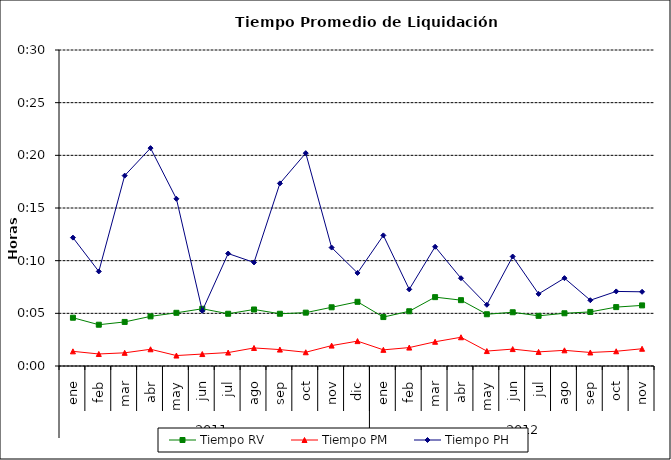
| Category | Tiempo RV | Tiempo PM | Tiempo PH |
|---|---|---|---|
| 0 | 0.003 | 0.001 | 0.009 |
| 1 | 0.003 | 0.001 | 0.006 |
| 2 | 0.003 | 0.001 | 0.013 |
| 3 | 0.003 | 0.001 | 0.014 |
| 4 | 0.004 | 0.001 | 0.011 |
| 5 | 0.004 | 0.001 | 0.004 |
| 6 | 0.003 | 0.001 | 0.007 |
| 7 | 0.004 | 0.001 | 0.007 |
| 8 | 0.003 | 0.001 | 0.012 |
| 9 | 0.004 | 0.001 | 0.014 |
| 10 | 0.004 | 0.001 | 0.008 |
| 11 | 0.004 | 0.002 | 0.006 |
| 12 | 0.003 | 0.001 | 0.009 |
| 13 | 0.004 | 0.001 | 0.005 |
| 14 | 0.005 | 0.002 | 0.008 |
| 15 | 0.004 | 0.002 | 0.006 |
| 16 | 0.003 | 0.001 | 0.004 |
| 17 | 0.004 | 0.001 | 0.007 |
| 18 | 0.003 | 0.001 | 0.005 |
| 19 | 0.004 | 0.001 | 0.006 |
| 20 | 0.004 | 0.001 | 0.004 |
| 21 | 0.004 | 0.001 | 0.005 |
| 22 | 0.004 | 0.001 | 0.005 |